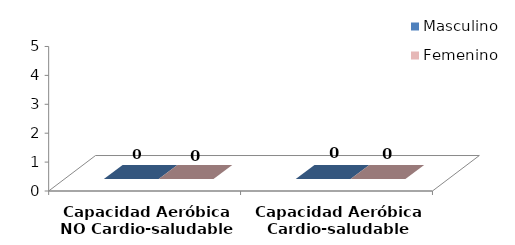
| Category | Masculino | Femenino |
|---|---|---|
| Capacidad Aeróbica NO Cardio-saludable | 0 | 0 |
| Capacidad Aeróbica Cardio-saludable | 0 | 0 |